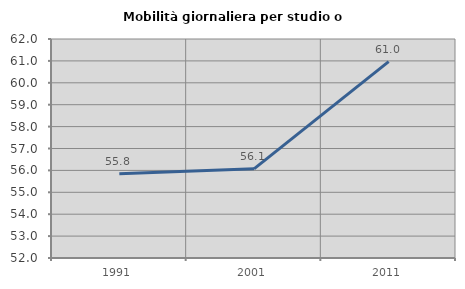
| Category | Mobilità giornaliera per studio o lavoro |
|---|---|
| 1991.0 | 55.845 |
| 2001.0 | 56.071 |
| 2011.0 | 60.969 |